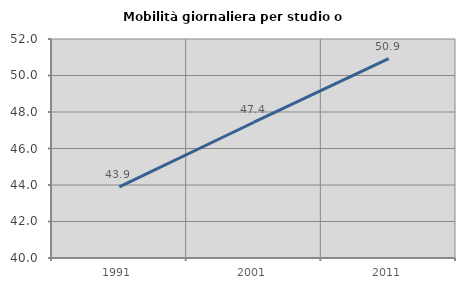
| Category | Mobilità giornaliera per studio o lavoro |
|---|---|
| 1991.0 | 43.898 |
| 2001.0 | 47.439 |
| 2011.0 | 50.923 |